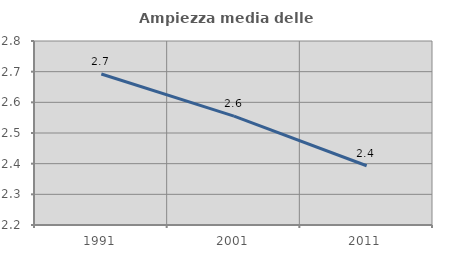
| Category | Ampiezza media delle famiglie |
|---|---|
| 1991.0 | 2.692 |
| 2001.0 | 2.555 |
| 2011.0 | 2.393 |